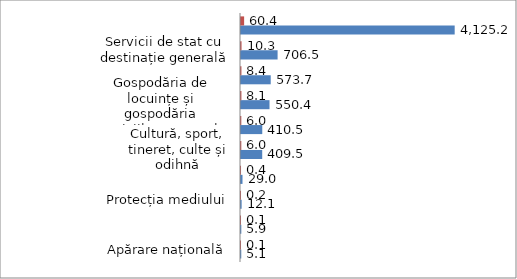
| Category | Series 0 | Series 1 |
|---|---|---|
| Apărare națională | 5.1 | 0.1 |
| Ordine publică și securitate națională | 5.9 | 0.1 |
| Protecția mediului | 12.1 | 0.2 |
| Ocrotirea sănătății | 29 | 0.4 |
| Cultură, sport, tineret, culte și odihnă | 409.5 | 6 |
| Servicii în domeniul economiei | 410.5 | 6 |
| Gospodăria de locuințe și gospodăria serviciilor comunale | 550.4 | 8.1 |
| Protecție socială | 573.7 | 8.4 |
| Servicii de stat cu destinație generală | 706.5 | 10.3 |
| Învățămînt | 4125.2 | 60.4 |